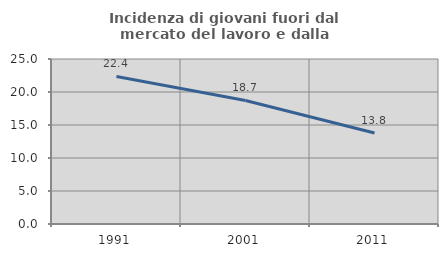
| Category | Incidenza di giovani fuori dal mercato del lavoro e dalla formazione  |
|---|---|
| 1991.0 | 22.359 |
| 2001.0 | 18.717 |
| 2011.0 | 13.777 |